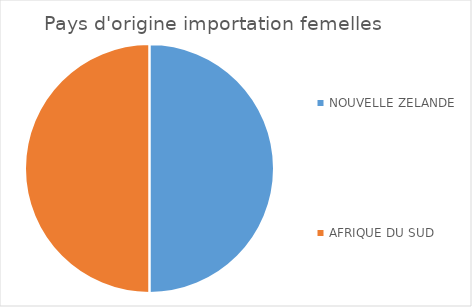
| Category | Series 0 |
|---|---|
| NOUVELLE ZELANDE | 1 |
| AFRIQUE DU SUD | 1 |